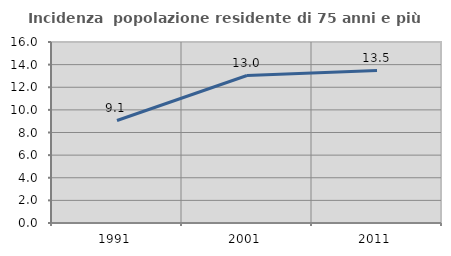
| Category | Incidenza  popolazione residente di 75 anni e più |
|---|---|
| 1991.0 | 9.058 |
| 2001.0 | 13.038 |
| 2011.0 | 13.474 |